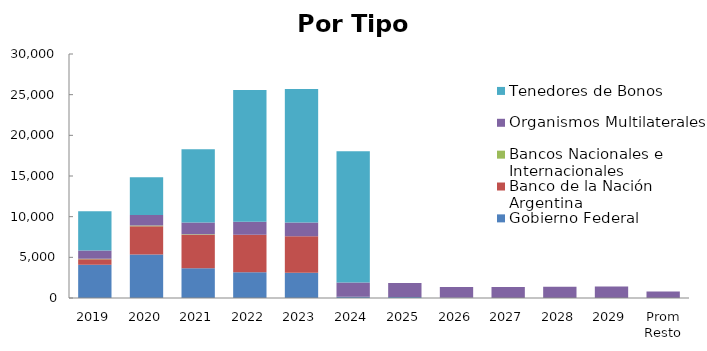
| Category | Gobierno Federal | Banco de la Nación Argentina | Bancos Nacionales e Internacionales | Organismos Multilaterales | Tenedores de Bonos |
|---|---|---|---|---|---|
| 2019 | 4087.072 | 669.987 | 79.763 | 1013.818 | 4804.072 |
| 2020 | 5354.752 | 3464.699 | 95.167 | 1278.045 | 4658.731 |
| 2021 | 3645.345 | 4126.338 | 51.474 | 1453.441 | 9016.969 |
| 2022 | 3162.267 | 4622.788 | 0 | 1599.38 | 16176.751 |
| 2023 | 3119.189 | 4479.324 | 0 | 1681.656 | 16425.804 |
| 2024 | 167.273 | 0 | 0 | 1729.56 | 16151.406 |
| 2025 | 108.383 | 0 | 0 | 1736.825 | 6.734 |
| 2026 | 33.485 | 0 | 0 | 1306.936 | 0 |
| 2027 | 0 | 0 | 0 | 1338.669 | 0 |
| 2028 | 0 | 0 | 0 | 1371.176 | 0 |
| 2029 | 0 | 0 | 0 | 1401.762 | 0 |
| Prom Resto | 0 | 0 | 0 | 791.332 | 0 |